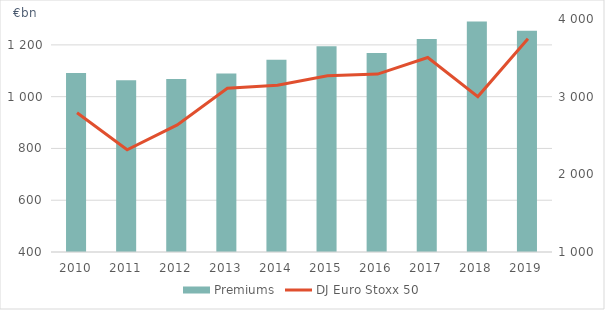
| Category | Premiums |
|---|---|
| 2010.0 | 1091.042 |
| 2011.0 | 1062.958 |
| 2012.0 | 1068.594 |
| 2013.0 | 1089.197 |
| 2014.0 | 1142.605 |
| 2015.0 | 1194.387 |
| 2016.0 | 1168.766 |
| 2017.0 | 1222.558 |
| 2018.0 | 1290.566 |
| 2019.0 | 1254.267 |